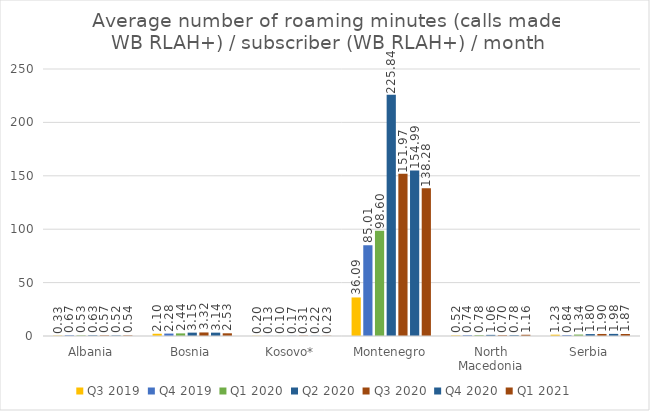
| Category | Q3 2019 | Q4 2019 | Q1 2020 | Q2 2020 | Q3 2020 | Q4 2020 | Q1 2021 |
|---|---|---|---|---|---|---|---|
| Albania | 0.334 | 0.67 | 0.529 | 0.628 | 0.565 | 0.515 | 0.538 |
| Bosnia | 2.103 | 2.279 | 2.44 | 3.145 | 3.322 | 3.142 | 2.53 |
| Kosovo* | 0.203 | 0.128 | 0.105 | 0.172 | 0.309 | 0.217 | 0.23 |
| Montenegro | 36.09 | 85.012 | 98.596 | 225.843 | 151.968 | 154.993 | 138.277 |
| North Macedonia | 0.523 | 0.744 | 0.779 | 1.055 | 0.699 | 0.776 | 1.158 |
| Serbia | 1.228 | 0.844 | 1.338 | 1.802 | 1.902 | 1.985 | 1.87 |